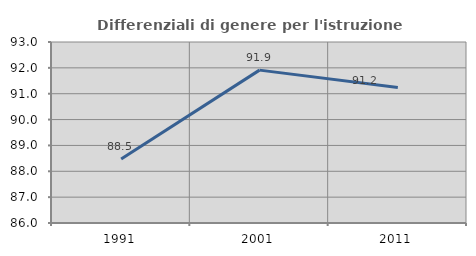
| Category | Differenziali di genere per l'istruzione superiore |
|---|---|
| 1991.0 | 88.473 |
| 2001.0 | 91.912 |
| 2011.0 | 91.243 |